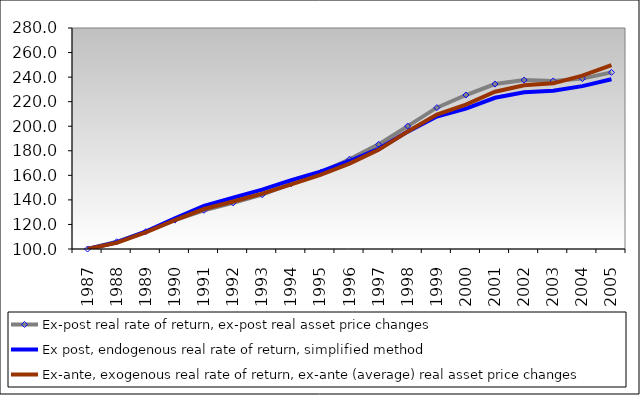
| Category | Ex-post real rate of return, ex-post real asset price changes | Ex post, endogenous real rate of return, simplified method | Ex-ante, exogenous real rate of return, ex-ante (average) real asset price changes |
|---|---|---|---|
| 1987.0 | 100 | 100 | 100 |
| 1988.0 | 105.863 | 105.382 | 105.006 |
| 1989.0 | 114.12 | 114.254 | 113.5 |
| 1990.0 | 123.528 | 125.062 | 123.475 |
| 1991.0 | 131.523 | 135.013 | 132.559 |
| 1992.0 | 137.57 | 141.704 | 138.638 |
| 1993.0 | 144.234 | 148.353 | 145.082 |
| 1994.0 | 153.147 | 156.132 | 152.707 |
| 1995.0 | 162.226 | 163.018 | 160.355 |
| 1996.0 | 173.121 | 171.674 | 169.516 |
| 1997.0 | 185.206 | 181.577 | 180.75 |
| 1998.0 | 200.109 | 195.604 | 195.747 |
| 1999.0 | 215.122 | 207.914 | 209.485 |
| 2000.0 | 225.42 | 214.332 | 217.593 |
| 2001.0 | 234.331 | 223.154 | 228.079 |
| 2002.0 | 237.616 | 227.592 | 233.299 |
| 2003.0 | 236.887 | 228.86 | 234.907 |
| 2004.0 | 238.771 | 232.664 | 241.216 |
| 2005.0 | 243.847 | 238.251 | 249.81 |